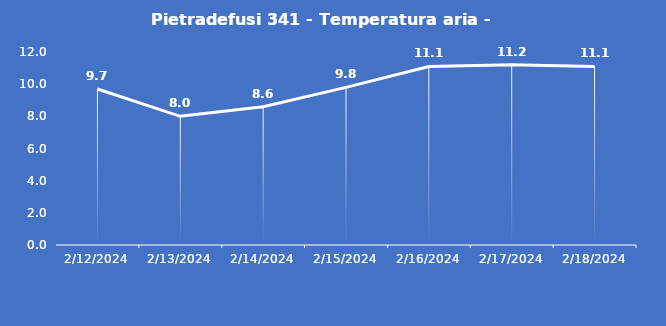
| Category | Pietradefusi 341 - Temperatura aria - Grezzo (°C) |
|---|---|
| 2/12/24 | 9.7 |
| 2/13/24 | 8 |
| 2/14/24 | 8.6 |
| 2/15/24 | 9.8 |
| 2/16/24 | 11.1 |
| 2/17/24 | 11.2 |
| 2/18/24 | 11.1 |